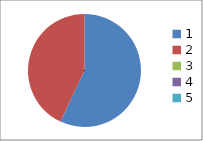
| Category | Series 0 |
|---|---|
| 0 | 0.57 |
| 1 | 0.43 |
| 2 | 0 |
| 3 | 0 |
| 4 | 0 |